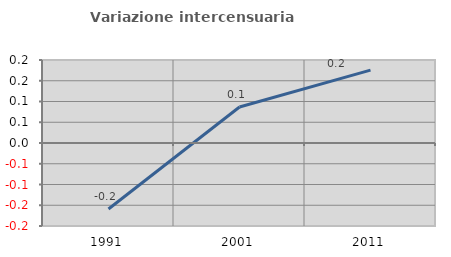
| Category | Variazione intercensuaria annua |
|---|---|
| 1991.0 | -0.159 |
| 2001.0 | 0.087 |
| 2011.0 | 0.176 |